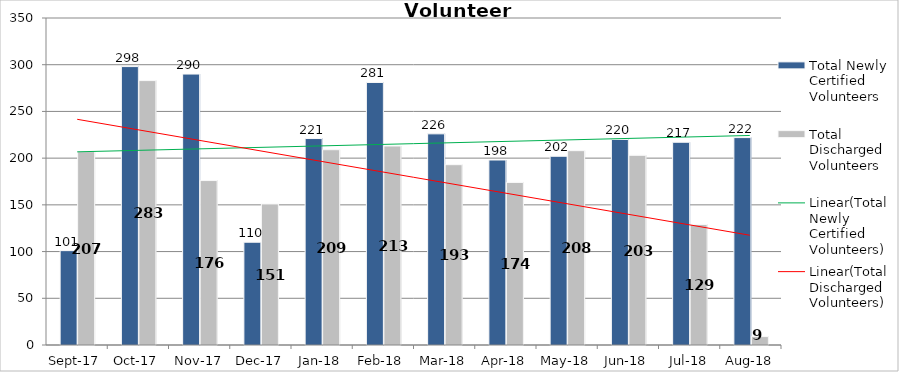
| Category | Total Newly Certified Volunteers | Total Discharged Volunteers |
|---|---|---|
| 2017-09-01 | 101 | 207 |
| 2017-10-01 | 298 | 283 |
| 2017-11-01 | 290 | 176 |
| 2017-12-01 | 110 | 151 |
| 2018-01-01 | 221 | 209 |
| 2018-02-01 | 281 | 213 |
| 2018-03-01 | 226 | 193 |
| 2018-04-01 | 198 | 174 |
| 2018-05-01 | 202 | 208 |
| 2018-06-01 | 220 | 203 |
| 2018-07-01 | 217 | 129 |
| 2018-08-01 | 222 | 9 |